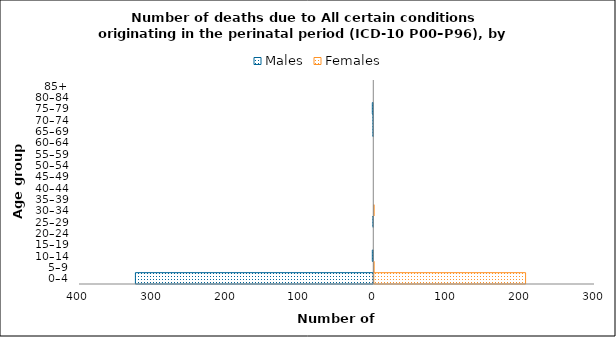
| Category | Males | Females |
|---|---|---|
| 0–4 | -324 | 207 |
| 5–9 | 0 | 1 |
| 10–14 | -2 | 0 |
| 15–19 | 0 | 0 |
| 20–24 | 0 | 0 |
| 25–29 | -1 | 0 |
| 30–34 | 0 | 1 |
| 35–39 | 0 | 0 |
| 40–44 | 0 | 0 |
| 45–49 | 0 | 0 |
| 50–54 | 0 | 0 |
| 55–59 | 0 | 0 |
| 60–64 | 0 | 0 |
| 65–69 | -1 | 0 |
| 70–74 | -1 | 0 |
| 75–79 | -2 | 0 |
| 80–84 | 0 | 0 |
| 85+ | 0 | 0 |